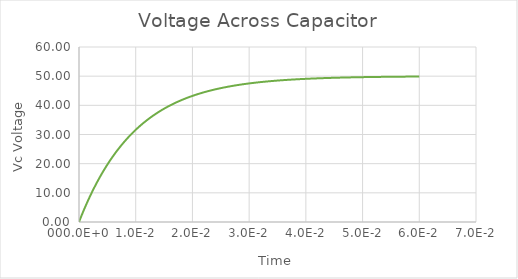
| Category | Series 0 |
|---|---|
| 0.0 | 0 |
| 0.0005 | 2.439 |
| 0.001 | 4.758 |
| 0.0015 | 6.965 |
| 0.002 | 9.063 |
| 0.0025 | 11.06 |
| 0.003 | 12.959 |
| 0.0035 | 14.766 |
| 0.004 | 16.484 |
| 0.0045 | 18.119 |
| 0.005 | 19.673 |
| 0.0055 | 21.153 |
| 0.006 | 22.559 |
| 0.0065 | 23.898 |
| 0.007 | 25.171 |
| 0.0075 | 26.382 |
| 0.008 | 27.534 |
| 0.0085 | 28.629 |
| 0.009 | 29.672 |
| 0.0095 | 30.663 |
| 0.01 | 31.606 |
| 0.0105 | 32.503 |
| 0.011 | 33.356 |
| 0.0115 | 34.168 |
| 0.012 | 34.94 |
| 0.0125 | 35.675 |
| 0.013 | 36.373 |
| 0.0135 | 37.038 |
| 0.014 | 37.67 |
| 0.0145 | 38.271 |
| 0.015 | 38.843 |
| 0.0155 | 39.388 |
| 0.016 | 39.905 |
| 0.0165 | 40.398 |
| 0.017 | 40.866 |
| 0.0175 | 41.311 |
| 0.018 | 41.735 |
| 0.0185 | 42.138 |
| 0.019 | 42.522 |
| 0.0195 | 42.886 |
| 0.02 | 43.233 |
| 0.0205 | 43.563 |
| 0.021 | 43.877 |
| 0.0215 | 44.176 |
| 0.022 | 44.46 |
| 0.0225 | 44.73 |
| 0.023 | 44.987 |
| 0.0235 | 45.232 |
| 0.024 | 45.464 |
| 0.0245 | 45.685 |
| 0.025 | 45.896 |
| 0.0255 | 46.096 |
| 0.026 | 46.286 |
| 0.0265 | 46.467 |
| 0.027 | 46.64 |
| 0.0275 | 46.804 |
| 0.028 | 46.959 |
| 0.0285 | 47.108 |
| 0.029 | 47.249 |
| 0.0295 | 47.383 |
| 0.03 | 47.511 |
| 0.0305 | 47.632 |
| 0.031 | 47.748 |
| 0.0315 | 47.857 |
| 0.032 | 47.962 |
| 0.0325 | 48.061 |
| 0.033 | 48.156 |
| 0.0335 | 48.246 |
| 0.034 | 48.331 |
| 0.0345 | 48.413 |
| 0.035 | 48.49 |
| 0.0355 | 48.564 |
| 0.036 | 48.634 |
| 0.0364999999999999 | 48.7 |
| 0.0369999999999999 | 48.764 |
| 0.0375 | 48.824 |
| 0.038 | 48.881 |
| 0.0384999999999999 | 48.936 |
| 0.0389999999999999 | 48.988 |
| 0.0394999999999999 | 49.037 |
| 0.0399999999999999 | 49.084 |
| 0.0404999999999999 | 49.129 |
| 0.0409999999999999 | 49.171 |
| 0.0414999999999999 | 49.212 |
| 0.0419999999999999 | 49.25 |
| 0.0424999999999999 | 49.287 |
| 0.0429999999999999 | 49.322 |
| 0.0434999999999999 | 49.355 |
| 0.0439999999999999 | 49.386 |
| 0.0444999999999999 | 49.416 |
| 0.0449999999999999 | 49.445 |
| 0.0454999999999999 | 49.472 |
| 0.0459999999999999 | 49.497 |
| 0.0464999999999999 | 49.522 |
| 0.0469999999999999 | 49.545 |
| 0.0474999999999999 | 49.567 |
| 0.0479999999999999 | 49.589 |
| 0.0484999999999999 | 49.609 |
| 0.0489999999999999 | 49.628 |
| 0.0494999999999999 | 49.646 |
| 0.0499999999999999 | 49.663 |
| 0.0504999999999999 | 49.68 |
| 0.0509999999999999 | 49.695 |
| 0.0514999999999999 | 49.71 |
| 0.0519999999999999 | 49.724 |
| 0.0524999999999999 | 49.738 |
| 0.0529999999999999 | 49.75 |
| 0.0534999999999999 | 49.763 |
| 0.0539999999999998 | 49.774 |
| 0.0544999999999998 | 49.785 |
| 0.0549999999999998 | 49.796 |
| 0.0554999999999998 | 49.806 |
| 0.0559999999999998 | 49.815 |
| 0.0564999999999998 | 49.824 |
| 0.0569999999999998 | 49.833 |
| 0.0574999999999998 | 49.841 |
| 0.0579999999999998 | 49.849 |
| 0.0584999999999998 | 49.856 |
| 0.0589999999999998 | 49.863 |
| 0.0594999999999998 | 49.87 |
| 0.0599999999999998 | 49.876 |